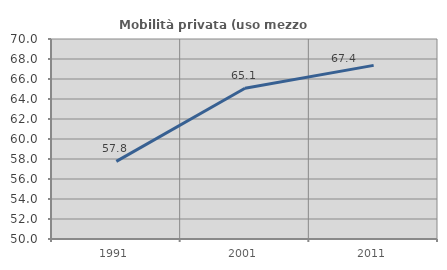
| Category | Mobilità privata (uso mezzo privato) |
|---|---|
| 1991.0 | 57.761 |
| 2001.0 | 65.079 |
| 2011.0 | 67.362 |